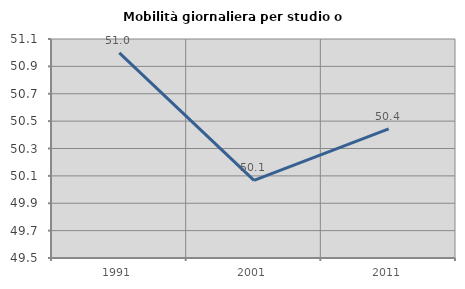
| Category | Mobilità giornaliera per studio o lavoro |
|---|---|
| 1991.0 | 50.998 |
| 2001.0 | 50.067 |
| 2011.0 | 50.443 |